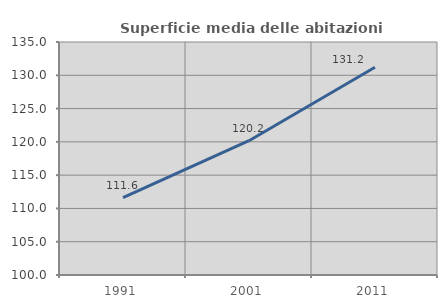
| Category | Superficie media delle abitazioni occupate |
|---|---|
| 1991.0 | 111.617 |
| 2001.0 | 120.169 |
| 2011.0 | 131.218 |